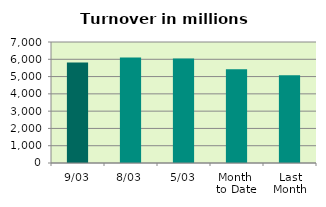
| Category | Series 0 |
|---|---|
| 9/03 | 5815.005 |
| 8/03 | 6110.501 |
| 5/03 | 6049.701 |
| Month 
to Date | 5417.7 |
| Last
Month | 5069.383 |